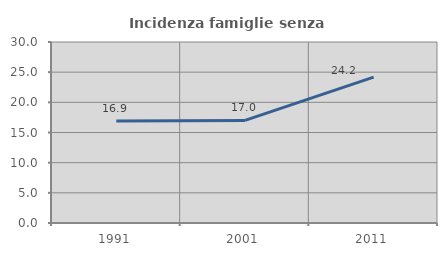
| Category | Incidenza famiglie senza nuclei |
|---|---|
| 1991.0 | 16.907 |
| 2001.0 | 16.999 |
| 2011.0 | 24.172 |